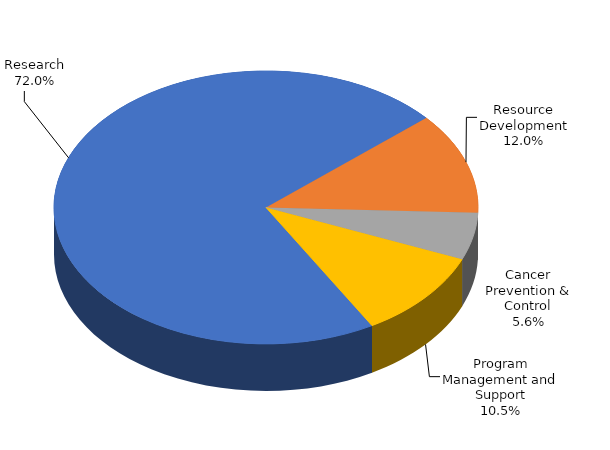
| Category | Research |
|---|---|
| Research | 0.72 |
| Resource Development | 0.12 |
| Cancer Prevention & Control | 0.056 |
| Program Management and Support | 0.105 |